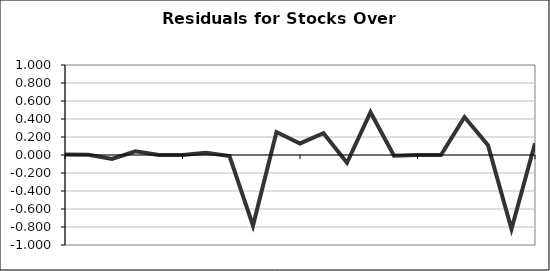
| Category | Series 0 |
|---|---|
| 0 | 0.005 |
| 1 | 0.002 |
| 2 | -0.045 |
| 3 | 0.041 |
| 4 | 0 |
| 5 | 0 |
| 6 | 0.024 |
| 7 | -0.011 |
| 8 | -0.784 |
| 9 | 0.256 |
| 10 | 0.129 |
| 11 | 0.242 |
| 12 | -0.086 |
| 13 | 0.476 |
| 14 | -0.008 |
| 15 | 0 |
| 16 | -0.001 |
| 17 | 0.422 |
| 18 | 0.109 |
| 19 | -0.822 |
| 20 | 0.13 |